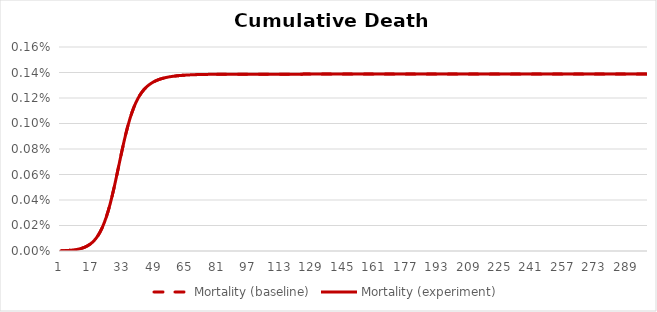
| Category | Mortality (baseline) | Mortality (experiment) |
|---|---|---|
| 0 | 0 | 0 |
| 1 | 0 | 0 |
| 2 | 0 | 0 |
| 3 | 0 | 0 |
| 4 | 0 | 0 |
| 5 | 0 | 0 |
| 6 | 0 | 0 |
| 7 | 0 | 0 |
| 8 | 0 | 0 |
| 9 | 0 | 0 |
| 10 | 0 | 0 |
| 11 | 0 | 0 |
| 12 | 0 | 0 |
| 13 | 0 | 0 |
| 14 | 0 | 0 |
| 15 | 0 | 0 |
| 16 | 0 | 0 |
| 17 | 0 | 0 |
| 18 | 0 | 0 |
| 19 | 0 | 0 |
| 20 | 0 | 0 |
| 21 | 0 | 0 |
| 22 | 0 | 0 |
| 23 | 0 | 0 |
| 24 | 0 | 0 |
| 25 | 0 | 0 |
| 26 | 0 | 0 |
| 27 | 0 | 0 |
| 28 | 0.001 | 0.001 |
| 29 | 0.001 | 0.001 |
| 30 | 0.001 | 0.001 |
| 31 | 0.001 | 0.001 |
| 32 | 0.001 | 0.001 |
| 33 | 0.001 | 0.001 |
| 34 | 0.001 | 0.001 |
| 35 | 0.001 | 0.001 |
| 36 | 0.001 | 0.001 |
| 37 | 0.001 | 0.001 |
| 38 | 0.001 | 0.001 |
| 39 | 0.001 | 0.001 |
| 40 | 0.001 | 0.001 |
| 41 | 0.001 | 0.001 |
| 42 | 0.001 | 0.001 |
| 43 | 0.001 | 0.001 |
| 44 | 0.001 | 0.001 |
| 45 | 0.001 | 0.001 |
| 46 | 0.001 | 0.001 |
| 47 | 0.001 | 0.001 |
| 48 | 0.001 | 0.001 |
| 49 | 0.001 | 0.001 |
| 50 | 0.001 | 0.001 |
| 51 | 0.001 | 0.001 |
| 52 | 0.001 | 0.001 |
| 53 | 0.001 | 0.001 |
| 54 | 0.001 | 0.001 |
| 55 | 0.001 | 0.001 |
| 56 | 0.001 | 0.001 |
| 57 | 0.001 | 0.001 |
| 58 | 0.001 | 0.001 |
| 59 | 0.001 | 0.001 |
| 60 | 0.001 | 0.001 |
| 61 | 0.001 | 0.001 |
| 62 | 0.001 | 0.001 |
| 63 | 0.001 | 0.001 |
| 64 | 0.001 | 0.001 |
| 65 | 0.001 | 0.001 |
| 66 | 0.001 | 0.001 |
| 67 | 0.001 | 0.001 |
| 68 | 0.001 | 0.001 |
| 69 | 0.001 | 0.001 |
| 70 | 0.001 | 0.001 |
| 71 | 0.001 | 0.001 |
| 72 | 0.001 | 0.001 |
| 73 | 0.001 | 0.001 |
| 74 | 0.001 | 0.001 |
| 75 | 0.001 | 0.001 |
| 76 | 0.001 | 0.001 |
| 77 | 0.001 | 0.001 |
| 78 | 0.001 | 0.001 |
| 79 | 0.001 | 0.001 |
| 80 | 0.001 | 0.001 |
| 81 | 0.001 | 0.001 |
| 82 | 0.001 | 0.001 |
| 83 | 0.001 | 0.001 |
| 84 | 0.001 | 0.001 |
| 85 | 0.001 | 0.001 |
| 86 | 0.001 | 0.001 |
| 87 | 0.001 | 0.001 |
| 88 | 0.001 | 0.001 |
| 89 | 0.001 | 0.001 |
| 90 | 0.001 | 0.001 |
| 91 | 0.001 | 0.001 |
| 92 | 0.001 | 0.001 |
| 93 | 0.001 | 0.001 |
| 94 | 0.001 | 0.001 |
| 95 | 0.001 | 0.001 |
| 96 | 0.001 | 0.001 |
| 97 | 0.001 | 0.001 |
| 98 | 0.001 | 0.001 |
| 99 | 0.001 | 0.001 |
| 100 | 0.001 | 0.001 |
| 101 | 0.001 | 0.001 |
| 102 | 0.001 | 0.001 |
| 103 | 0.001 | 0.001 |
| 104 | 0.001 | 0.001 |
| 105 | 0.001 | 0.001 |
| 106 | 0.001 | 0.001 |
| 107 | 0.001 | 0.001 |
| 108 | 0.001 | 0.001 |
| 109 | 0.001 | 0.001 |
| 110 | 0.001 | 0.001 |
| 111 | 0.001 | 0.001 |
| 112 | 0.001 | 0.001 |
| 113 | 0.001 | 0.001 |
| 114 | 0.001 | 0.001 |
| 115 | 0.001 | 0.001 |
| 116 | 0.001 | 0.001 |
| 117 | 0.001 | 0.001 |
| 118 | 0.001 | 0.001 |
| 119 | 0.001 | 0.001 |
| 120 | 0.001 | 0.001 |
| 121 | 0.001 | 0.001 |
| 122 | 0.001 | 0.001 |
| 123 | 0.001 | 0.001 |
| 124 | 0.001 | 0.001 |
| 125 | 0.001 | 0.001 |
| 126 | 0.001 | 0.001 |
| 127 | 0.001 | 0.001 |
| 128 | 0.001 | 0.001 |
| 129 | 0.001 | 0.001 |
| 130 | 0.001 | 0.001 |
| 131 | 0.001 | 0.001 |
| 132 | 0.001 | 0.001 |
| 133 | 0.001 | 0.001 |
| 134 | 0.001 | 0.001 |
| 135 | 0.001 | 0.001 |
| 136 | 0.001 | 0.001 |
| 137 | 0.001 | 0.001 |
| 138 | 0.001 | 0.001 |
| 139 | 0.001 | 0.001 |
| 140 | 0.001 | 0.001 |
| 141 | 0.001 | 0.001 |
| 142 | 0.001 | 0.001 |
| 143 | 0.001 | 0.001 |
| 144 | 0.001 | 0.001 |
| 145 | 0.001 | 0.001 |
| 146 | 0.001 | 0.001 |
| 147 | 0.001 | 0.001 |
| 148 | 0.001 | 0.001 |
| 149 | 0.001 | 0.001 |
| 150 | 0.001 | 0.001 |
| 151 | 0.001 | 0.001 |
| 152 | 0.001 | 0.001 |
| 153 | 0.001 | 0.001 |
| 154 | 0.001 | 0.001 |
| 155 | 0.001 | 0.001 |
| 156 | 0.001 | 0.001 |
| 157 | 0.001 | 0.001 |
| 158 | 0.001 | 0.001 |
| 159 | 0.001 | 0.001 |
| 160 | 0.001 | 0.001 |
| 161 | 0.001 | 0.001 |
| 162 | 0.001 | 0.001 |
| 163 | 0.001 | 0.001 |
| 164 | 0.001 | 0.001 |
| 165 | 0.001 | 0.001 |
| 166 | 0.001 | 0.001 |
| 167 | 0.001 | 0.001 |
| 168 | 0.001 | 0.001 |
| 169 | 0.001 | 0.001 |
| 170 | 0.001 | 0.001 |
| 171 | 0.001 | 0.001 |
| 172 | 0.001 | 0.001 |
| 173 | 0.001 | 0.001 |
| 174 | 0.001 | 0.001 |
| 175 | 0.001 | 0.001 |
| 176 | 0.001 | 0.001 |
| 177 | 0.001 | 0.001 |
| 178 | 0.001 | 0.001 |
| 179 | 0.001 | 0.001 |
| 180 | 0.001 | 0.001 |
| 181 | 0.001 | 0.001 |
| 182 | 0.001 | 0.001 |
| 183 | 0.001 | 0.001 |
| 184 | 0.001 | 0.001 |
| 185 | 0.001 | 0.001 |
| 186 | 0.001 | 0.001 |
| 187 | 0.001 | 0.001 |
| 188 | 0.001 | 0.001 |
| 189 | 0.001 | 0.001 |
| 190 | 0.001 | 0.001 |
| 191 | 0.001 | 0.001 |
| 192 | 0.001 | 0.001 |
| 193 | 0.001 | 0.001 |
| 194 | 0.001 | 0.001 |
| 195 | 0.001 | 0.001 |
| 196 | 0.001 | 0.001 |
| 197 | 0.001 | 0.001 |
| 198 | 0.001 | 0.001 |
| 199 | 0.001 | 0.001 |
| 200 | 0.001 | 0.001 |
| 201 | 0.001 | 0.001 |
| 202 | 0.001 | 0.001 |
| 203 | 0.001 | 0.001 |
| 204 | 0.001 | 0.001 |
| 205 | 0.001 | 0.001 |
| 206 | 0.001 | 0.001 |
| 207 | 0.001 | 0.001 |
| 208 | 0.001 | 0.001 |
| 209 | 0.001 | 0.001 |
| 210 | 0.001 | 0.001 |
| 211 | 0.001 | 0.001 |
| 212 | 0.001 | 0.001 |
| 213 | 0.001 | 0.001 |
| 214 | 0.001 | 0.001 |
| 215 | 0.001 | 0.001 |
| 216 | 0.001 | 0.001 |
| 217 | 0.001 | 0.001 |
| 218 | 0.001 | 0.001 |
| 219 | 0.001 | 0.001 |
| 220 | 0.001 | 0.001 |
| 221 | 0.001 | 0.001 |
| 222 | 0.001 | 0.001 |
| 223 | 0.001 | 0.001 |
| 224 | 0.001 | 0.001 |
| 225 | 0.001 | 0.001 |
| 226 | 0.001 | 0.001 |
| 227 | 0.001 | 0.001 |
| 228 | 0.001 | 0.001 |
| 229 | 0.001 | 0.001 |
| 230 | 0.001 | 0.001 |
| 231 | 0.001 | 0.001 |
| 232 | 0.001 | 0.001 |
| 233 | 0.001 | 0.001 |
| 234 | 0.001 | 0.001 |
| 235 | 0.001 | 0.001 |
| 236 | 0.001 | 0.001 |
| 237 | 0.001 | 0.001 |
| 238 | 0.001 | 0.001 |
| 239 | 0.001 | 0.001 |
| 240 | 0.001 | 0.001 |
| 241 | 0.001 | 0.001 |
| 242 | 0.001 | 0.001 |
| 243 | 0.001 | 0.001 |
| 244 | 0.001 | 0.001 |
| 245 | 0.001 | 0.001 |
| 246 | 0.001 | 0.001 |
| 247 | 0.001 | 0.001 |
| 248 | 0.001 | 0.001 |
| 249 | 0.001 | 0.001 |
| 250 | 0.001 | 0.001 |
| 251 | 0.001 | 0.001 |
| 252 | 0.001 | 0.001 |
| 253 | 0.001 | 0.001 |
| 254 | 0.001 | 0.001 |
| 255 | 0.001 | 0.001 |
| 256 | 0.001 | 0.001 |
| 257 | 0.001 | 0.001 |
| 258 | 0.001 | 0.001 |
| 259 | 0.001 | 0.001 |
| 260 | 0.001 | 0.001 |
| 261 | 0.001 | 0.001 |
| 262 | 0.001 | 0.001 |
| 263 | 0.001 | 0.001 |
| 264 | 0.001 | 0.001 |
| 265 | 0.001 | 0.001 |
| 266 | 0.001 | 0.001 |
| 267 | 0.001 | 0.001 |
| 268 | 0.001 | 0.001 |
| 269 | 0.001 | 0.001 |
| 270 | 0.001 | 0.001 |
| 271 | 0.001 | 0.001 |
| 272 | 0.001 | 0.001 |
| 273 | 0.001 | 0.001 |
| 274 | 0.001 | 0.001 |
| 275 | 0.001 | 0.001 |
| 276 | 0.001 | 0.001 |
| 277 | 0.001 | 0.001 |
| 278 | 0.001 | 0.001 |
| 279 | 0.001 | 0.001 |
| 280 | 0.001 | 0.001 |
| 281 | 0.001 | 0.001 |
| 282 | 0.001 | 0.001 |
| 283 | 0.001 | 0.001 |
| 284 | 0.001 | 0.001 |
| 285 | 0.001 | 0.001 |
| 286 | 0.001 | 0.001 |
| 287 | 0.001 | 0.001 |
| 288 | 0.001 | 0.001 |
| 289 | 0.001 | 0.001 |
| 290 | 0.001 | 0.001 |
| 291 | 0.001 | 0.001 |
| 292 | 0.001 | 0.001 |
| 293 | 0.001 | 0.001 |
| 294 | 0.001 | 0.001 |
| 295 | 0.001 | 0.001 |
| 296 | 0.001 | 0.001 |
| 297 | 0.001 | 0.001 |
| 298 | 0.001 | 0.001 |